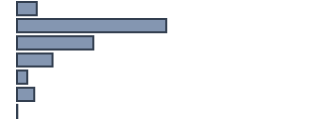
| Category | Series 0 |
|---|---|
| 0 | 6.4 |
| 1 | 48.3 |
| 2 | 24.7 |
| 3 | 11.5 |
| 4 | 3.3 |
| 5 | 5.6 |
| 6 | 0.1 |